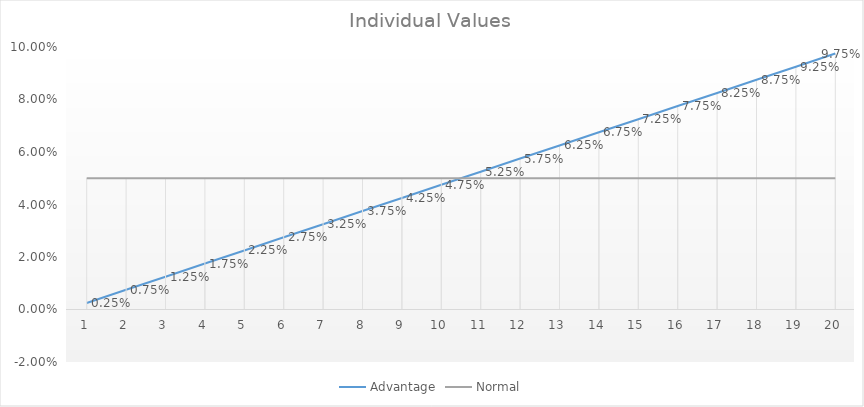
| Category | Advantage | Normal |
|---|---|---|
| 1.0 | 0.002 | 0.05 |
| 2.0 | 0.008 | 0.05 |
| 3.0 | 0.012 | 0.05 |
| 4.0 | 0.018 | 0.05 |
| 5.0 | 0.022 | 0.05 |
| 6.0 | 0.028 | 0.05 |
| 7.0 | 0.032 | 0.05 |
| 8.0 | 0.038 | 0.05 |
| 9.0 | 0.042 | 0.05 |
| 10.0 | 0.048 | 0.05 |
| 11.0 | 0.052 | 0.05 |
| 12.0 | 0.058 | 0.05 |
| 13.0 | 0.062 | 0.05 |
| 14.0 | 0.068 | 0.05 |
| 15.0 | 0.072 | 0.05 |
| 16.0 | 0.078 | 0.05 |
| 17.0 | 0.082 | 0.05 |
| 18.0 | 0.088 | 0.05 |
| 19.0 | 0.092 | 0.05 |
| 20.0 | 0.098 | 0.05 |